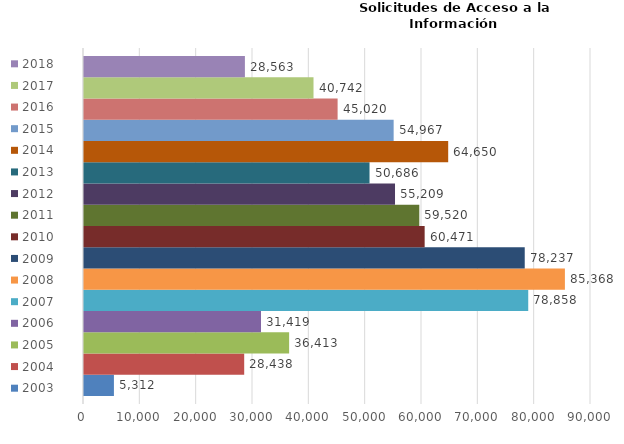
| Category | 2003 | 2004 | 2005 | 2006 | 2007 | 2008 | 2009 | 2010 | 2011 | 2012 | 2013 | 2014 | 2015 | 2016 | 2017 | 2018 |
|---|---|---|---|---|---|---|---|---|---|---|---|---|---|---|---|---|
| 0 | 5312 | 28438 | 36413 | 31419 | 78858 | 85368 | 78237 | 60471 | 59520 | 55209 | 50686 | 64650 | 54967 | 45020 | 40742 | 28563 |